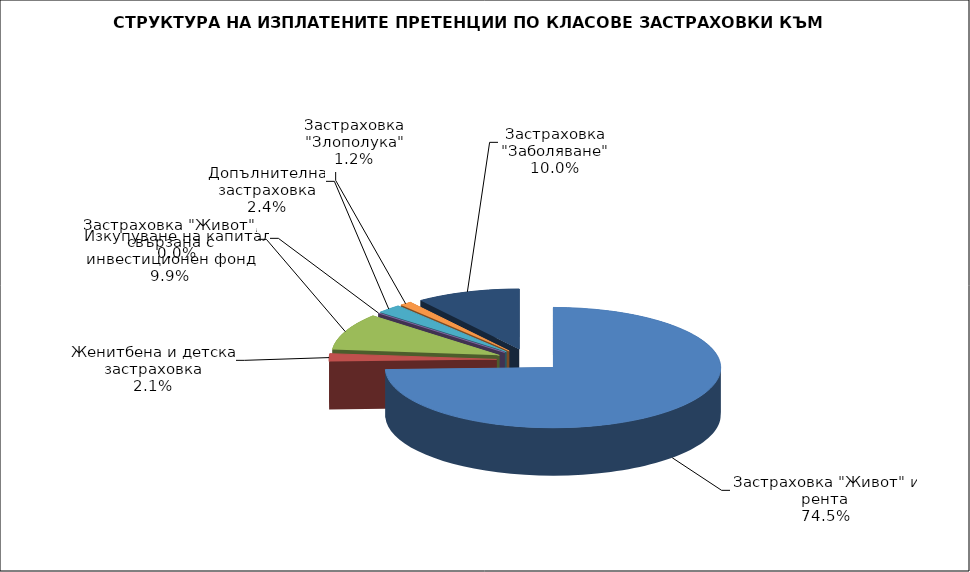
| Category | 19 534 218 540 092 2 594 062 0 634 277 302 656 2 628 372 |
|---|---|
| Застраховка "Живот" и рента | 19534217.945 |
| Женитбена и детска застраховка | 540092.26 |
| Застраховка "Живот", свързана с инвестиционен фонд | 2594062.26 |
| Изкупуване на капитал | 0 |
| Допълнителна застраховка | 634276.71 |
| Застраховка "Злополука" | 302656.3 |
| Застраховка "Заболяване" | 2628372.27 |